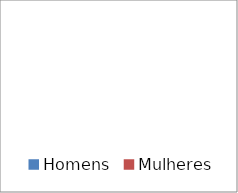
| Category | Series 0 |
|---|---|
| Homens | 0 |
| Mulheres | 0 |